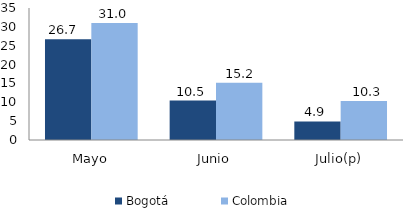
| Category | Bogotá | Colombia |
|---|---|---|
| Mayo | 26.711 | 30.993 |
| Junio | 10.455 | 15.201 |
| Julio(p) | 4.928 | 10.316 |